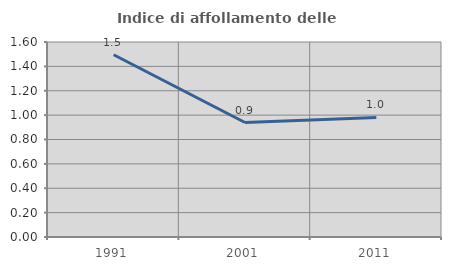
| Category | Indice di affollamento delle abitazioni  |
|---|---|
| 1991.0 | 1.496 |
| 2001.0 | 0.939 |
| 2011.0 | 0.981 |